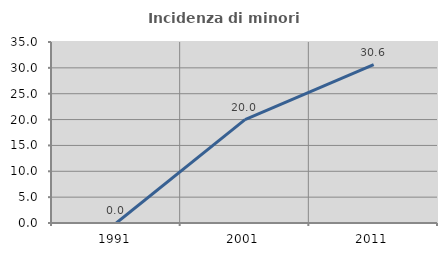
| Category | Incidenza di minori stranieri |
|---|---|
| 1991.0 | 0 |
| 2001.0 | 20 |
| 2011.0 | 30.645 |